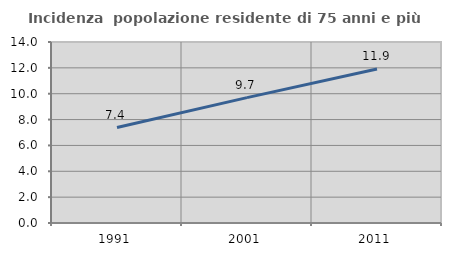
| Category | Incidenza  popolazione residente di 75 anni e più |
|---|---|
| 1991.0 | 7.383 |
| 2001.0 | 9.697 |
| 2011.0 | 11.909 |